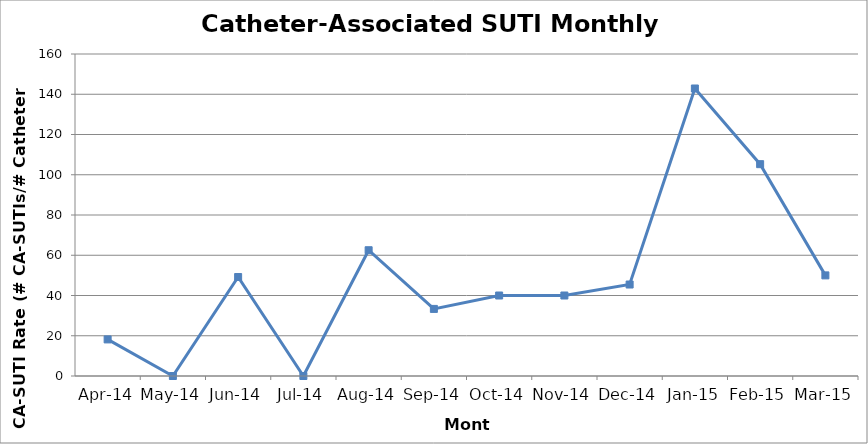
| Category | Series 2 |
|---|---|
| 2014-04-01 | 18.182 |
| 2014-05-01 | 0 |
| 2014-06-01 | 49.18 |
| 2014-07-01 | 0 |
| 2014-08-01 | 62.5 |
| 2014-09-01 | 33.333 |
| 2014-10-01 | 40 |
| 2014-11-01 | 40 |
| 2014-12-01 | 45.455 |
| 2015-01-01 | 142.857 |
| 2015-02-01 | 105.263 |
| 2015-03-01 | 50 |